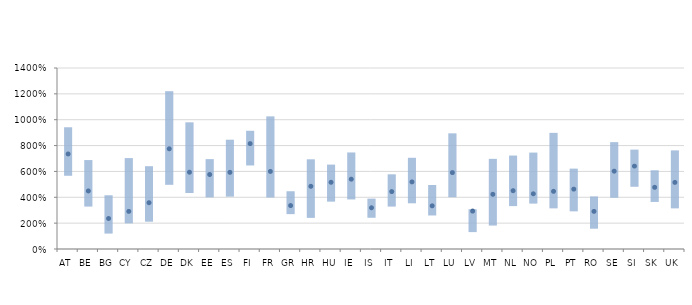
| Category | 25% | 50% | 75% |
|---|---|---|---|
| AT | 5.67 | 7.35 | 9.41 |
| BE | 3.29 | 4.49 | 6.88 |
| BG | 1.2 | 2.36 | 4.15 |
| CY | 1.99 | 2.91 | 7.03 |
| CZ | 2.12 | 3.58 | 6.4 |
| DE | 4.97 | 7.75 | 12.21 |
| DK | 4.33 | 5.94 | 9.79 |
| EE | 4 | 5.76 | 6.95 |
| ES | 4.06 | 5.93 | 8.45 |
| FI | 6.47 | 8.15 | 9.14 |
| FR | 3.99 | 6 | 10.25 |
| GR | 2.7 | 3.36 | 4.46 |
| HR | 2.41 | 4.85 | 6.93 |
| HU | 3.67 | 5.16 | 6.52 |
| IE | 3.84 | 5.4 | 7.46 |
| IS | 2.42 | 3.19 | 3.89 |
| IT | 3.29 | 4.44 | 5.77 |
| LI | 3.54 | 5.19 | 7.05 |
| LT | 2.6 | 3.34 | 4.95 |
| LU | 4.01 | 5.91 | 8.94 |
| LV | 1.31 | 2.93 | 3.07 |
| MT | 1.82 | 4.23 | 6.97 |
| NL | 3.32 | 4.51 | 7.22 |
| NO | 3.52 | 4.27 | 7.45 |
| PL | 3.15 | 4.46 | 8.98 |
| PT | 2.92 | 4.63 | 6.21 |
| RO | 1.58 | 2.91 | 4.06 |
| SE | 3.97 | 6.02 | 8.26 |
| SI | 4.82 | 6.41 | 7.68 |
| SK | 3.64 | 4.77 | 6.08 |
| UK | 3.15 | 5.15 | 7.62 |